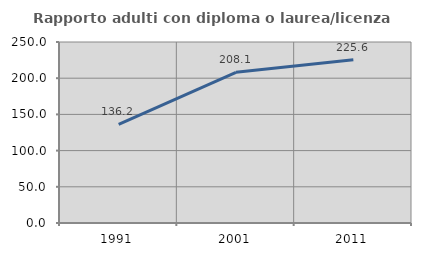
| Category | Rapporto adulti con diploma o laurea/licenza media  |
|---|---|
| 1991.0 | 136.207 |
| 2001.0 | 208.108 |
| 2011.0 | 225.581 |